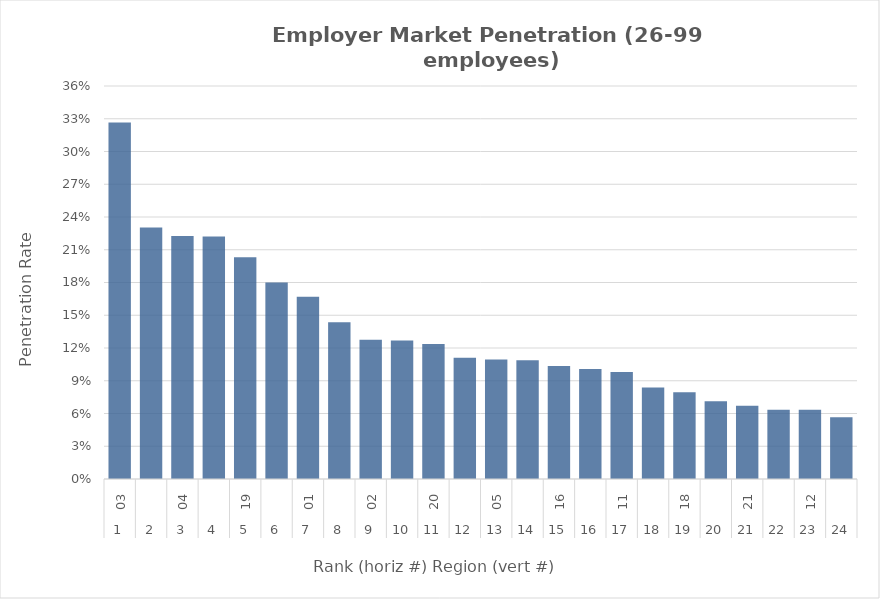
| Category | Rate |
|---|---|
| 0 | 0.327 |
| 1 | 0.23 |
| 2 | 0.223 |
| 3 | 0.222 |
| 4 | 0.203 |
| 5 | 0.18 |
| 6 | 0.167 |
| 7 | 0.144 |
| 8 | 0.127 |
| 9 | 0.127 |
| 10 | 0.124 |
| 11 | 0.111 |
| 12 | 0.109 |
| 13 | 0.109 |
| 14 | 0.103 |
| 15 | 0.101 |
| 16 | 0.098 |
| 17 | 0.084 |
| 18 | 0.08 |
| 19 | 0.071 |
| 20 | 0.067 |
| 21 | 0.063 |
| 22 | 0.063 |
| 23 | 0.057 |